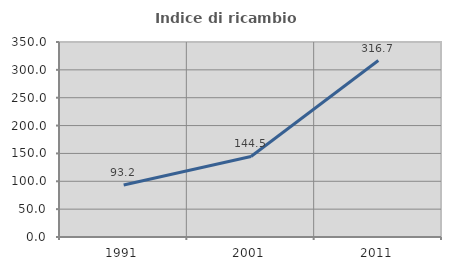
| Category | Indice di ricambio occupazionale  |
|---|---|
| 1991.0 | 93.233 |
| 2001.0 | 144.516 |
| 2011.0 | 316.667 |